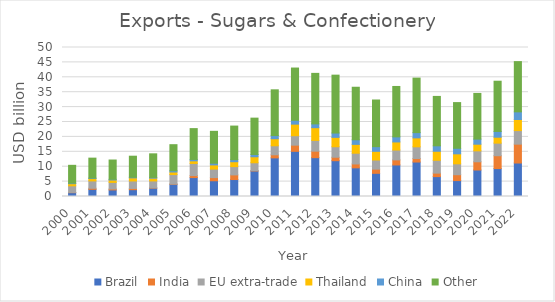
| Category | Brazil | India | EU extra-trade | Thailand | China | Other  |
|---|---|---|---|---|---|---|
| 2000.0 | 1293.06 | 77.326 | 2212.481 | 722.48 | 172.889 | 5982.944 |
| 2001.0 | 2398.02 | 357.892 | 2471.805 | 797.727 | 155.578 | 6694.314 |
| 2002.0 | 2211.258 | 311.804 | 2208.433 | 801.896 | 226.967 | 6482.003 |
| 2003.0 | 2287.66 | 413.761 | 2509.185 | 1051.243 | 196.377 | 7064.655 |
| 2004.0 | 2815.366 | 74.75 | 2330.376 | 937.364 | 252.229 | 7908.697 |
| 2005.0 | 4102.976 | 77.662 | 3175.923 | 863.842 | 417.512 | 8750.135 |
| 2006.0 | 6346.57 | 680.053 | 4068.476 | 873.842 | 462.42 | 10350.985 |
| 2007.0 | 5280.136 | 1071.322 | 2848.92 | 1403.518 | 565.772 | 10698.19 |
| 2008.0 | 5693.534 | 1556.295 | 2777.939 | 1645.422 | 676.693 | 11283.339 |
| 2009.0 | 8561.866 | 95.903 | 2660.695 | 2012.597 | 771.243 | 12195.065 |
| 2010.0 | 12954.236 | 1039.857 | 3029.909 | 2373.068 | 1059.719 | 15340.105 |
| 2011.0 | 15152.931 | 2075.113 | 3172.371 | 3883.822 | 1289.956 | 17533.785 |
| 2012.0 | 13029.907 | 2185.228 | 3608.27 | 4273.418 | 1265.264 | 16955.95 |
| 2013.0 | 12013.621 | 1161.675 | 3520.247 | 3151.792 | 1451.715 | 19421.003 |
| 2014.0 | 9615.985 | 1306.198 | 3598.676 | 2971.493 | 1540.355 | 17628.008 |
| 2015.0 | 7781.112 | 1405.187 | 3051.501 | 2921.237 | 1562.49 | 15659.525 |
| 2016.0 | 10584.675 | 1695.888 | 3305.446 | 2717.867 | 1706.742 | 16914.93 |
| 2017.0 | 11566.378 | 1168.884 | 3935.493 | 3005.886 | 1759.254 | 18295.327 |
| 2018.0 | 6671.771 | 1174.562 | 4300.105 | 3033.717 | 1828.875 | 16576.131 |
| 2019.0 | 5340.407 | 1973.221 | 3647.607 | 3359.438 | 1861.349 | 15329.053 |
| 2020.0 | 8887.159 | 2763.938 | 3664.547 | 2235.565 | 1702.784 | 15334.039 |
| 2021.0 | 9375.318 | 4310.232 | 4218.372 | 1993.746 | 1931.021 | 16856.024 |
| 2022.0 | 11239.96 | 6327.113 | 4550.938 | 3729.269 | 2560.218 | 16857.009 |